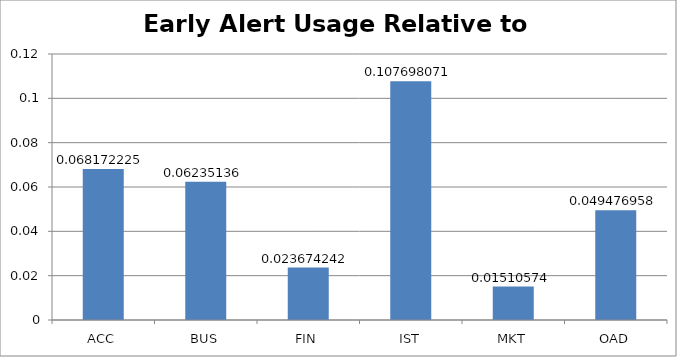
| Category | Series 0 |
|---|---|
| ACC | 0.068 |
| BUS | 0.062 |
| FIN | 0.024 |
| IST | 0.108 |
| MKT | 0.015 |
| OAD | 0.049 |